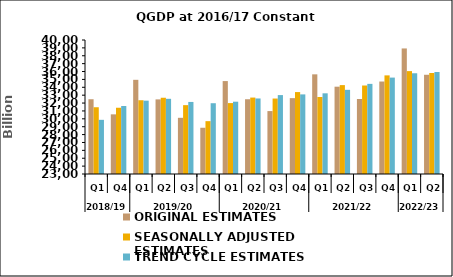
| Category | ORIGINAL ESTIMATES | SEASONALLY ADJUSTED ESTIMATES | TREND CYCLE ESTIMATES |
|---|---|---|---|
| 0 | 29774.014 | 31468.772 | 30972.646 |
| 1 | 30568.4 | 31405.512 | 31625.258 |
| 2 | 34947.971 | 32359.158 | 32304.67 |
| 3 | 32466.17 | 32673.582 | 32538.77 |
| 4 | 30129.17 | 31735.211 | 32141.778 |
| 5 | 28867.102 | 29704.233 | 31979.605 |
| 6 | 34788.599 | 31996.599 | 32172.508 |
| 7 | 32485.71 | 32696.082 | 32581.789 |
| 8 | 30982.275 | 32574.127 | 33011.127 |
| 9 | 32624.434 | 33393.763 | 33099.368 |
| 10 | 35644.21 | 32771.747 | 33236.3 |
| 11 | 34076.609 | 34276.718 | 33678.48 |
| 12 | 32514.711 | 34226.547 | 34433.425 |
| 13 | 34731.63 | 35511.698 | 35231.819 |
| 14 | 38928.701 | 36052.504 | 35781.258 |
| 15 | 35589.394 | 35815.882 | 35938.41 |